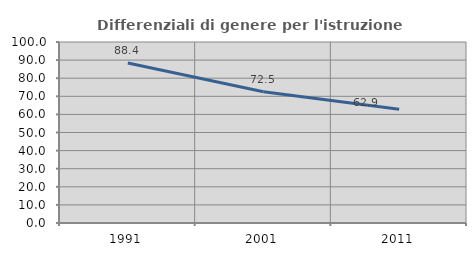
| Category | Differenziali di genere per l'istruzione superiore |
|---|---|
| 1991.0 | 88.352 |
| 2001.0 | 72.517 |
| 2011.0 | 62.876 |